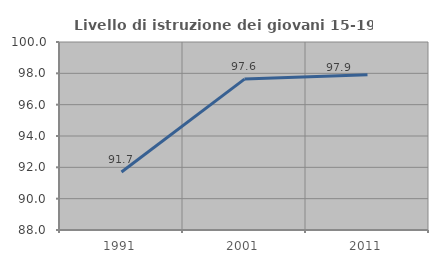
| Category | Livello di istruzione dei giovani 15-19 anni |
|---|---|
| 1991.0 | 91.702 |
| 2001.0 | 97.632 |
| 2011.0 | 97.917 |